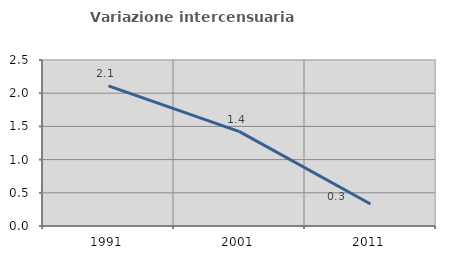
| Category | Variazione intercensuaria annua |
|---|---|
| 1991.0 | 2.111 |
| 2001.0 | 1.422 |
| 2011.0 | 0.332 |